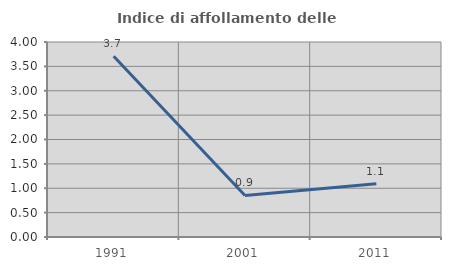
| Category | Indice di affollamento delle abitazioni  |
|---|---|
| 1991.0 | 3.708 |
| 2001.0 | 0.853 |
| 2011.0 | 1.09 |